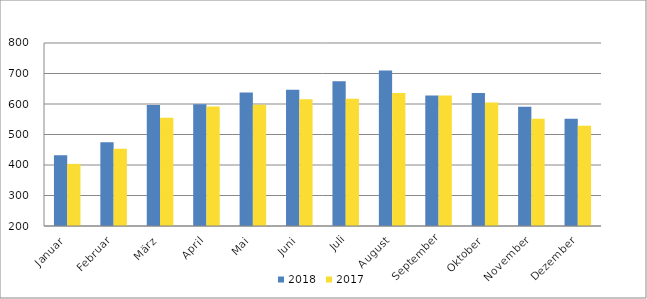
| Category | 2018 | 2017 |
|---|---|---|
| Januar | 432173 | 403667 |
| Februar | 474199 | 453120 |
| März | 596955 | 555047 |
| April | 599499 | 591635 |
| Mai | 637653 | 597360 |
| Juni | 646660 | 615741 |
| Juli | 674698 | 617362 |
| August | 710141 | 636257 |
| September | 627533 | 627996 |
| Oktober | 636078 | 604529 |
| November | 590756 | 551875 |
| Dezember | 551672 | 528289 |